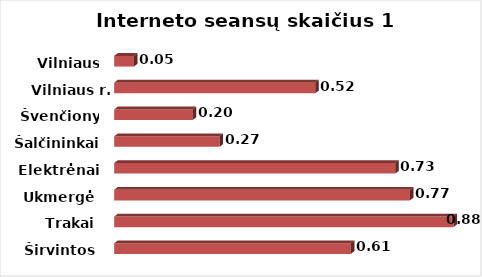
| Category | Series 0 |
|---|---|
| Širvintos | 0.614 |
| Trakai | 0.88 |
| Ukmergė | 0.768 |
| Elektrėnai | 0.729 |
| Šalčininkai | 0.273 |
| Švenčionys | 0.203 |
| Vilniaus r. | 0.522 |
| Vilniaus m. | 0.051 |